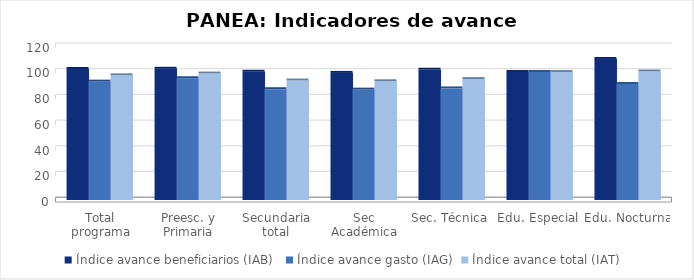
| Category | Índice avance beneficiarios (IAB)  | Índice avance gasto (IAG) | Índice avance total (IAT)  |
|---|---|---|---|
| Total programa | 101.953 | 92.137 | 97.045 |
| Preesc. y Primaria | 102.114 | 94.743 | 98.428 |
| Secundaria total | 99.77 | 86.235 | 93.002 |
| Sec Académica | 98.894 | 85.91 | 92.402 |
| Sec. Técnica | 101.38 | 86.829 | 94.105 |
| Edu. Especial | 99.602 | 99.605 | 99.604 |
| Edu. Nocturna | 109.747 | 90.259 | 100.003 |